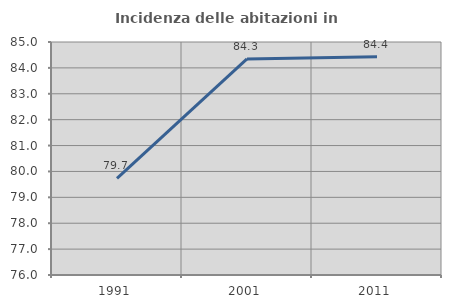
| Category | Incidenza delle abitazioni in proprietà  |
|---|---|
| 1991.0 | 79.734 |
| 2001.0 | 84.344 |
| 2011.0 | 84.432 |